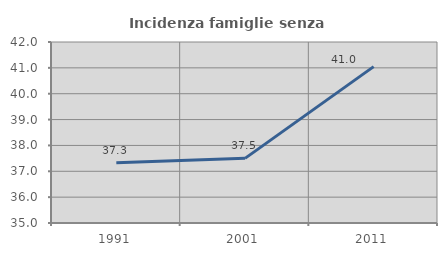
| Category | Incidenza famiglie senza nuclei |
|---|---|
| 1991.0 | 37.33 |
| 2001.0 | 37.5 |
| 2011.0 | 41.047 |